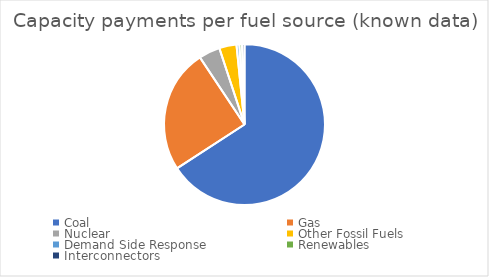
| Category | Amount (known data) |
|---|---|
| Coal | 15548328556.504 |
| Gas | 5867629580.632 |
| Nuclear | 1007308121.24 |
| Other Fossil Fuels | 820482837.641 |
| Demand Side Response | 134805794.816 |
| Renewables | 124689352.014 |
| Interconnectors | 117590084.149 |